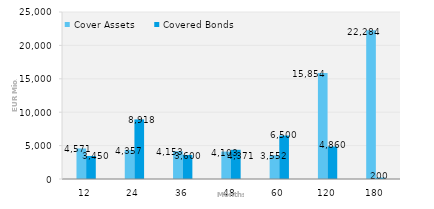
| Category | Cover Assets | Covered Bonds |
|---|---|---|
| 12.0 | 4571.393 | 3450 |
| 24.0 | 4356.706 | 8917.593 |
| 36.0 | 4153.311 | 3600 |
| 48.0 | 4102.766 | 4371.282 |
| 60.0 | 3551.738 | 6500 |
| 120.0 | 15853.61 | 4859.752 |
| 180.0 | 22283.745 | 200 |